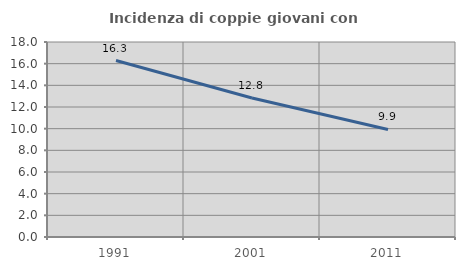
| Category | Incidenza di coppie giovani con figli |
|---|---|
| 1991.0 | 16.289 |
| 2001.0 | 12.835 |
| 2011.0 | 9.929 |